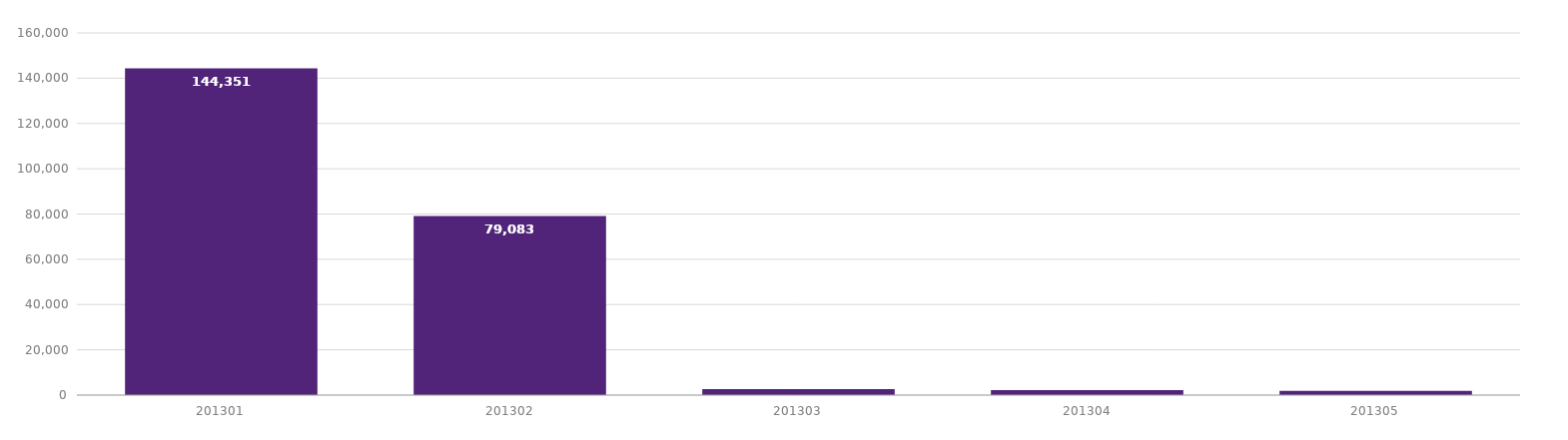
| Category | CA HT Net |
|---|---|
| 201301 | 144351.3 |
| 201302 | 79083.17 |
| 201303 | 2630 |
| 201304 | 2158.56 |
| 201305 | 1857.92 |